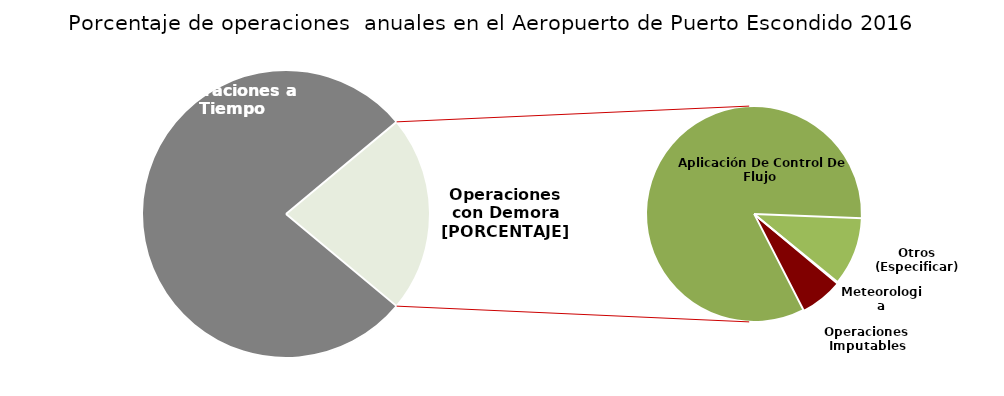
| Category | Series 0 |
|---|---|
| Operaciones a Tiempo | 1924 |
| Operaciones Imputables | 35 |
| Aplicación De Control De Flujo  | 454 |
| Otros (Especificar) | 56 |
| Meteorologia | 1 |